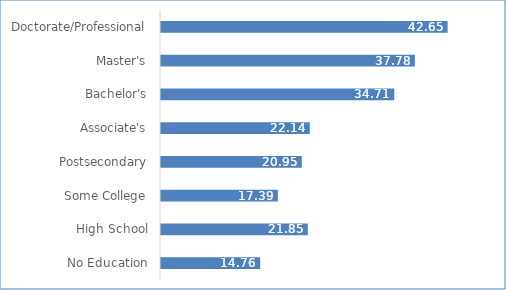
| Category | Series 0 |
|---|---|
| No Education | 14.76 |
| High School | 21.85 |
| Some College | 17.39 |
| Postsecondary | 20.95 |
| Associate's | 22.14 |
| Bachelor's | 34.71 |
| Master's | 37.78 |
| Doctorate/Professional | 42.65 |